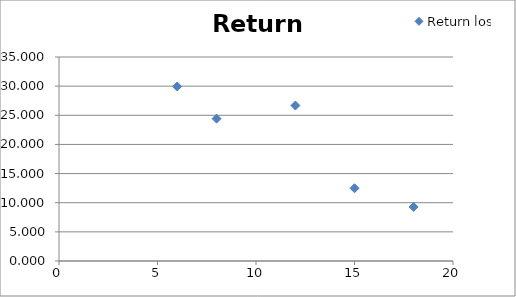
| Category | Return loss |
|---|---|
| 6.0 | 29.943 |
| 8.0 | 24.426 |
| 12.0 | 26.674 |
| 15.0 | 12.481 |
| 18.0 | 9.271 |